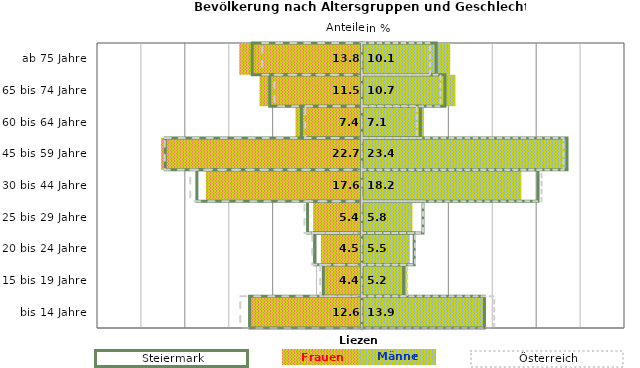
| Category | Frauen | Männer | Frauen Spalte2 | Männer Spalte2 | Frauen Spalte3 | Männer Spalte3 |
|---|---|---|---|---|---|---|
| bis 14 Jahre | -12.6 | 13.9 | 14 | -12.8 | -13.8 | 15.1 |
| 15 bis 19 Jahre | -4.4 | 5.2 | 4.8 | -4.4 | -4.7 | 5.2 |
| 20 bis 24 Jahre | -4.5 | 5.5 | 6 | -5.4 | -5.6 | 6.1 |
| 25 bis 29 Jahre | -5.4 | 5.8 | 7 | -6.2 | -6.5 | 7 |
| 30 bis 44 Jahre | -17.6 | 18.2 | 20.1 | -18.8 | -19.5 | 20.5 |
| 45 bis 59 Jahre | -22.7 | 23.4 | 23.4 | -22.4 | -22.4 | 23 |
| 60 bis 64 Jahre | -7.4 | 7.1 | 6.7 | -6.9 | -6.4 | 6.3 |
| 65 bis 74 Jahre | -11.5 | 10.7 | 9.5 | -10.5 | -9.9 | 9 |
| ab 75 Jahre | -13.8 | 10.1 | 8.5 | -12.5 | -11.3 | 7.8 |